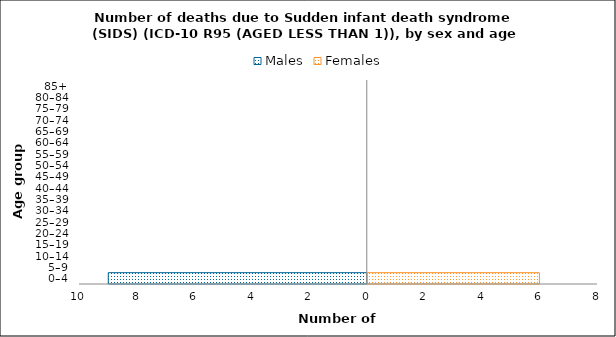
| Category | Males | Females |
|---|---|---|
| 0–4 | -9 | 6 |
| 5–9 | 0 | 0 |
| 10–14 | 0 | 0 |
| 15–19 | 0 | 0 |
| 20–24 | 0 | 0 |
| 25–29 | 0 | 0 |
| 30–34 | 0 | 0 |
| 35–39 | 0 | 0 |
| 40–44 | 0 | 0 |
| 45–49 | 0 | 0 |
| 50–54 | 0 | 0 |
| 55–59 | 0 | 0 |
| 60–64 | 0 | 0 |
| 65–69 | 0 | 0 |
| 70–74 | 0 | 0 |
| 75–79 | 0 | 0 |
| 80–84 | 0 | 0 |
| 85+ | 0 | 0 |